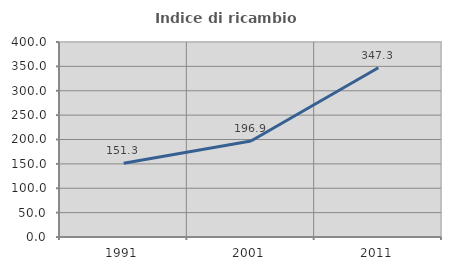
| Category | Indice di ricambio occupazionale  |
|---|---|
| 1991.0 | 151.293 |
| 2001.0 | 196.894 |
| 2011.0 | 347.26 |